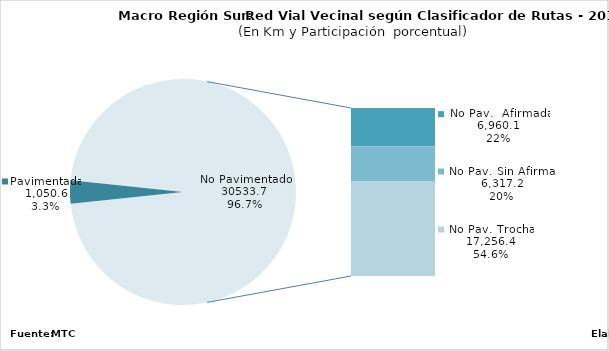
| Category | Series 0 |
|---|---|
| Pavimentada | 1050.623 |
| No Pavimentada                   Afirmada | 6960.129 |
| No Pavimentada                   Sin Afirmar | 6317.19 |
| No Pavimentada                            Trocha | 17256.423 |